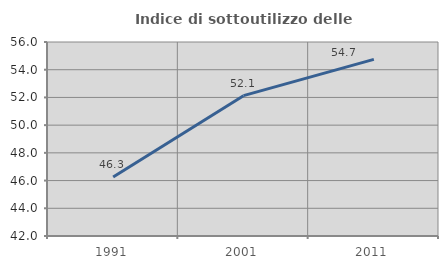
| Category | Indice di sottoutilizzo delle abitazioni  |
|---|---|
| 1991.0 | 46.259 |
| 2001.0 | 52.128 |
| 2011.0 | 54.745 |